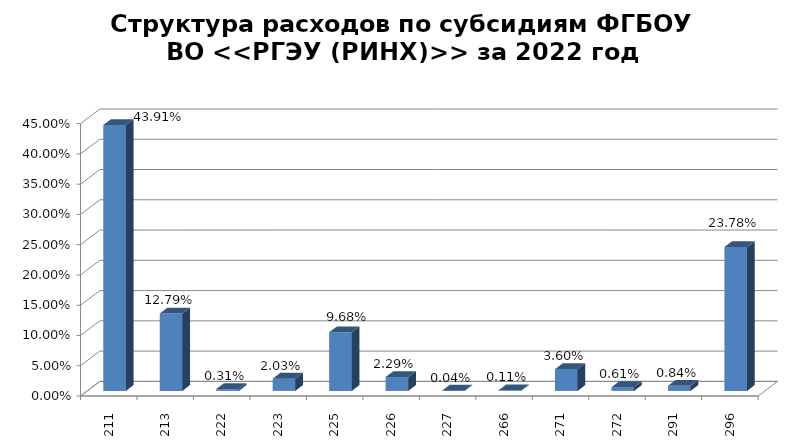
| Category | Series 0 |
|---|---|
|  211 | 0.439 |
|  213 | 0.128 |
|  222 | 0.003 |
|  223 | 0.02 |
|  225 | 0.097 |
|  226 | 0.023 |
| 227 | 0 |
| 266 | 0.001 |
| 271 | 0.036 |
| 272 | 0.006 |
| 291 | 0.008 |
| 296 | 0.238 |